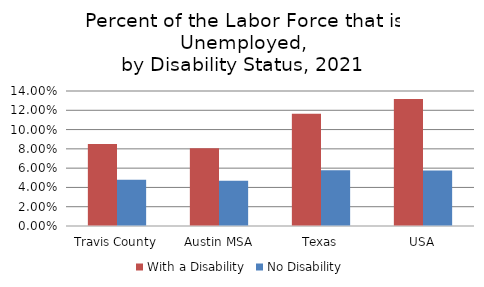
| Category | With a Disability | No Disability |
|---|---|---|
| Travis County | 0.085 | 0.048 |
| Austin MSA | 0.081 | 0.047 |
| Texas | 0.117 | 0.058 |
| USA | 0.132 | 0.058 |